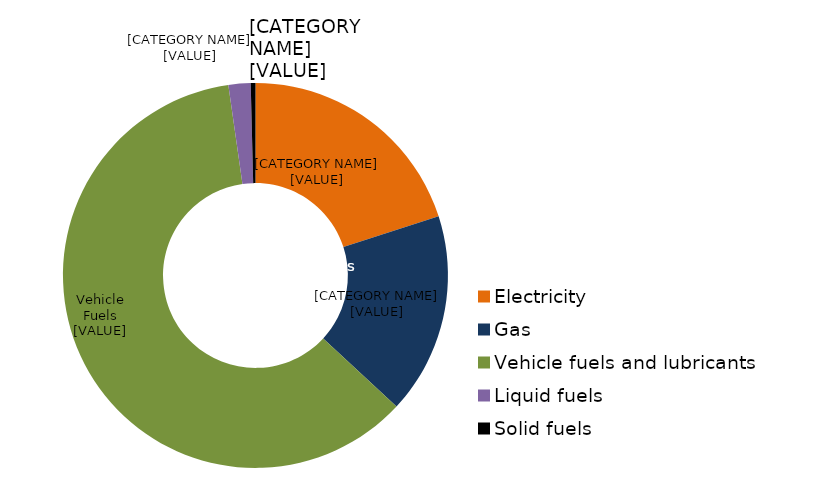
| Category | Series 0 |
|---|---|
| Electricity | 0.2 |
| Gas | 0.169 |
| Vehicle fuels and lubricants  | 0.608 |
| Liquid fuels | 0.019 |
| Solid fuels | 0.004 |